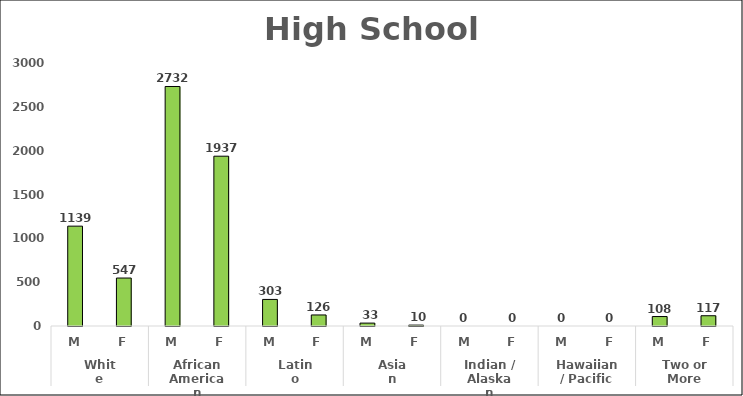
| Category | Series 0 |
|---|---|
| 0 | 1139 |
| 1 | 547 |
| 2 | 2732 |
| 3 | 1937 |
| 4 | 303 |
| 5 | 126 |
| 6 | 33 |
| 7 | 10 |
| 8 | 0 |
| 9 | 0 |
| 10 | 0 |
| 11 | 0 |
| 12 | 108 |
| 13 | 117 |